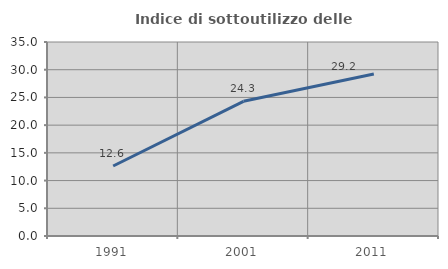
| Category | Indice di sottoutilizzo delle abitazioni  |
|---|---|
| 1991.0 | 12.631 |
| 2001.0 | 24.303 |
| 2011.0 | 29.227 |